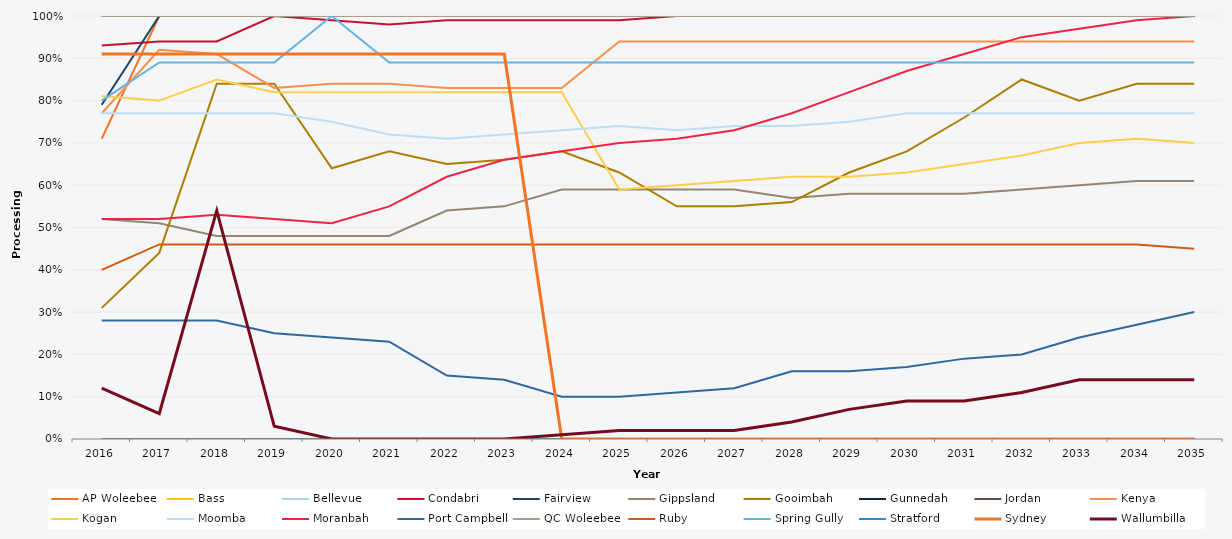
| Category | AP Woleebee | Bass | Bellevue | Condabri | Fairview | Gippsland | Gooimbah | Gunnedah | Jordan | Kenya | Kogan | Moomba | Moranbah | Port Campbell | QC Woleebee | Ruby | Spring Gully | Stratford | Sydney | Wallumbilla |
|---|---|---|---|---|---|---|---|---|---|---|---|---|---|---|---|---|---|---|---|---|
| 2016.0 | 0.71 | 1 | 1 | 0.93 | 0.79 | 0.52 | 0.31 | 0 | 1 | 0.77 | 0.81 | 0.77 | 0.52 | 0.28 | 1 | 0.4 | 0.8 | 0 | 0.91 | 0.12 |
| 2017.0 | 1 | 1 | 1 | 0.94 | 1 | 0.51 | 0.44 | 0 | 1 | 0.92 | 0.8 | 0.77 | 0.52 | 0.28 | 1 | 0.46 | 0.89 | 0 | 0.91 | 0.06 |
| 2018.0 | 1 | 1 | 1 | 0.94 | 1 | 0.48 | 0.84 | 0 | 1 | 0.91 | 0.85 | 0.77 | 0.53 | 0.28 | 1 | 0.46 | 0.89 | 0 | 0.91 | 0.54 |
| 2019.0 | 1 | 1 | 1 | 1 | 1 | 0.48 | 0.84 | 0 | 1 | 0.83 | 0.82 | 0.77 | 0.52 | 0.25 | 1 | 0.46 | 0.89 | 0 | 0.91 | 0.03 |
| 2020.0 | 1 | 1 | 1 | 0.99 | 1 | 0.48 | 0.64 | 0 | 1 | 0.84 | 0.82 | 0.75 | 0.51 | 0.24 | 1 | 0.46 | 1 | 0 | 0.91 | 0 |
| 2021.0 | 1 | 1 | 1 | 0.98 | 1 | 0.48 | 0.68 | 0 | 1 | 0.84 | 0.82 | 0.72 | 0.55 | 0.23 | 1 | 0.46 | 0.89 | 0 | 0.91 | 0 |
| 2022.0 | 1 | 1 | 1 | 0.99 | 1 | 0.54 | 0.65 | 0 | 1 | 0.83 | 0.82 | 0.71 | 0.62 | 0.15 | 1 | 0.46 | 0.89 | 0 | 0.91 | 0 |
| 2023.0 | 1 | 1 | 1 | 0.99 | 1 | 0.55 | 0.66 | 0 | 1 | 0.83 | 0.82 | 0.72 | 0.66 | 0.14 | 1 | 0.46 | 0.89 | 0 | 0.91 | 0 |
| 2024.0 | 1 | 1 | 1 | 0.99 | 1 | 0.59 | 0.68 | 0 | 1 | 0.83 | 0.82 | 0.73 | 0.68 | 0.1 | 1 | 0.46 | 0.89 | 0 | 0 | 0.01 |
| 2025.0 | 1 | 1 | 1 | 0.99 | 1 | 0.59 | 0.63 | 0 | 1 | 0.94 | 0.59 | 0.74 | 0.7 | 0.1 | 1 | 0.46 | 0.89 | 0 | 0 | 0.02 |
| 2026.0 | 1 | 1 | 1 | 1 | 1 | 0.59 | 0.55 | 0 | 1 | 0.94 | 0.6 | 0.73 | 0.71 | 0.11 | 1 | 0.46 | 0.89 | 0 | 0 | 0.02 |
| 2027.0 | 1 | 1 | 1 | 1 | 1 | 0.59 | 0.55 | 0 | 1 | 0.94 | 0.61 | 0.74 | 0.73 | 0.12 | 1 | 0.46 | 0.89 | 0 | 0 | 0.02 |
| 2028.0 | 1 | 1 | 1 | 1 | 1 | 0.57 | 0.56 | 0 | 1 | 0.94 | 0.62 | 0.74 | 0.77 | 0.16 | 1 | 0.46 | 0.89 | 0 | 0 | 0.04 |
| 2029.0 | 1 | 1 | 1 | 1 | 1 | 0.58 | 0.63 | 0 | 1 | 0.94 | 0.62 | 0.75 | 0.82 | 0.16 | 1 | 0.46 | 0.89 | 0 | 0 | 0.07 |
| 2030.0 | 1 | 1 | 1 | 1 | 1 | 0.58 | 0.68 | 0 | 1 | 0.94 | 0.63 | 0.77 | 0.87 | 0.17 | 1 | 0.46 | 0.89 | 0 | 0 | 0.09 |
| 2031.0 | 1 | 1 | 1 | 1 | 1 | 0.58 | 0.76 | 0 | 1 | 0.94 | 0.65 | 0.77 | 0.91 | 0.19 | 1 | 0.46 | 0.89 | 0 | 0 | 0.09 |
| 2032.0 | 1 | 1 | 1 | 1 | 1 | 0.59 | 0.85 | 0 | 1 | 0.94 | 0.67 | 0.77 | 0.95 | 0.2 | 1 | 0.46 | 0.89 | 0 | 0 | 0.11 |
| 2033.0 | 1 | 1 | 1 | 1 | 1 | 0.6 | 0.8 | 0 | 1 | 0.94 | 0.7 | 0.77 | 0.97 | 0.24 | 1 | 0.46 | 0.89 | 0 | 0 | 0.14 |
| 2034.0 | 1 | 1 | 1 | 1 | 1 | 0.61 | 0.84 | 0 | 1 | 0.94 | 0.71 | 0.77 | 0.99 | 0.27 | 1 | 0.46 | 0.89 | 0 | 0 | 0.14 |
| 2035.0 | 1 | 1 | 1 | 1 | 1 | 0.61 | 0.84 | 0 | 1 | 0.94 | 0.7 | 0.77 | 1 | 0.3 | 1 | 0.45 | 0.89 | 0 | 0 | 0.14 |